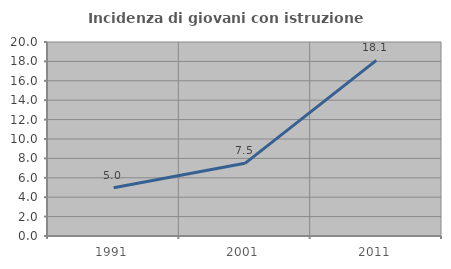
| Category | Incidenza di giovani con istruzione universitaria |
|---|---|
| 1991.0 | 4.984 |
| 2001.0 | 7.493 |
| 2011.0 | 18.108 |